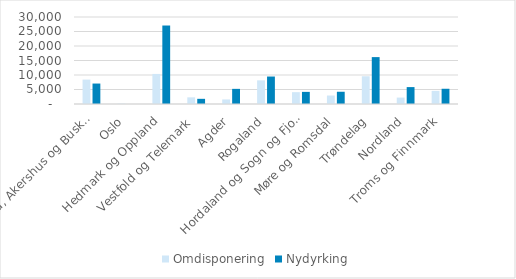
| Category | Omdisponering | Nydyrking |
|---|---|---|
| Østfold, Akershus og Buskerud | 8413 | 7054 |
| Oslo | 134 | 10 |
| Hedmark og Oppland | 10363 | 27063 |
| Vestfold og Telemark | 2296 | 1783 |
| Agder | 1572 | 5220 |
| Rogaland | 8159 | 9473 |
| Hordaland og Sogn og Fjordane | 4082 | 4180 |
| Møre og Romsdal | 2920 | 4222 |
| Trøndelag | 9564 | 16170 |
| Nordland | 2213 | 5829 |
| Troms og Finnmark | 4514 | 5254 |